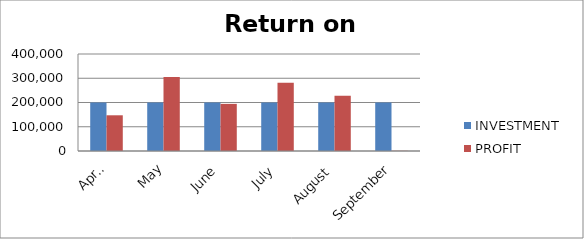
| Category | INVESTMENT  | PROFIT |
|---|---|---|
| April | 200000 | 147268 |
| May | 200000 | 305206 |
| June | 200000 | 194338 |
| July | 200000 | 281355 |
| August | 200000 | 227461 |
| September | 200000 | 750 |